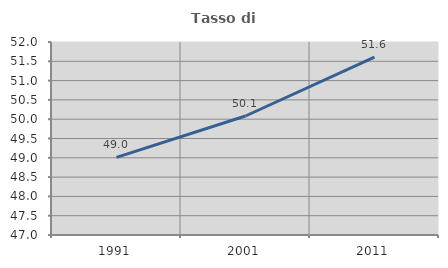
| Category | Tasso di occupazione   |
|---|---|
| 1991.0 | 49.011 |
| 2001.0 | 50.083 |
| 2011.0 | 51.607 |